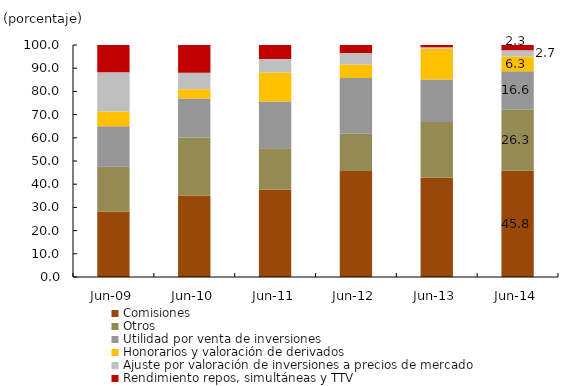
| Category | Comisiones | Otros | Utilidad por venta de inversiones | Honorarios y valoración de derivados | Ajuste por valoración de inversiones a precios de mercado | Rendimiento repos, simultáneas y TTV |
|---|---|---|---|---|---|---|
| 2009-06-01 | 28.242 | 19.29 | 17.417 | 6.344 | 16.974 | 11.732 |
| 2010-06-01 | 35.126 | 24.984 | 16.867 | 3.956 | 7.159 | 11.908 |
| 2011-06-01 | 37.598 | 17.921 | 20.12 | 12.501 | 5.797 | 6.063 |
| 2012-06-01 | 45.686 | 16.038 | 24.074 | 5.798 | 4.94 | 3.463 |
| 2013-06-01 | 42.79 | 24.015 | 18.298 | 13.228 | 0.707 | 0.962 |
| 2014-06-01 | 45.785 | 26.345 | 16.582 | 6.31 | 2.686 | 2.293 |